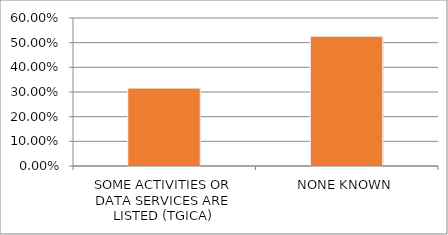
| Category | Series 0 |
|---|---|
| SOME ACTIVITIES OR DATA SERVICES ARE LISTED (TGICA) | 0.316 |
| NONE KNOWN | 0.526 |